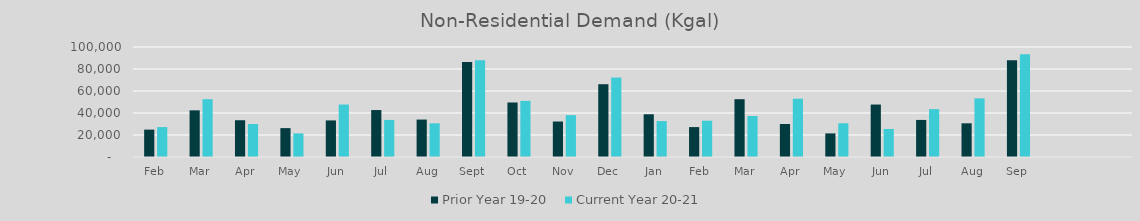
| Category | Prior Year 19-20  | Current Year 20-21 |
|---|---|---|
| Feb | 24891.705 | 27184.287 |
| Mar | 42416.796 | 52556.784 |
| Apr | 33427.881 | 30008.586 |
| May | 26254.448 | 21459.484 |
| Jun | 33248.873 | 47687.401 |
| Jul | 42679.938 | 33702.696 |
| Aug | 34036.498 | 30630.765 |
| Sep | 86367.775 | 87939.966 |
| Oct | 49561.754 | 51017.647 |
| Nov | 32261.42 | 38090.247 |
| Dec | 66164.871 | 72201.815 |
| Jan | 38851.995 | 32645.301 |
| Feb | 27184.287 | 32987.653 |
| Mar | 52556.784 | 37296.185 |
| Apr | 30008.586 | 52983.593 |
| May | 21459.484 | 30657.737 |
| Jun | 47687.401 | 25485.258 |
| Jul | 33702.696 | 43493.567 |
| Aug | 30630.765 | 53305.831 |
| Sep | 87939.966 | 93442.494 |